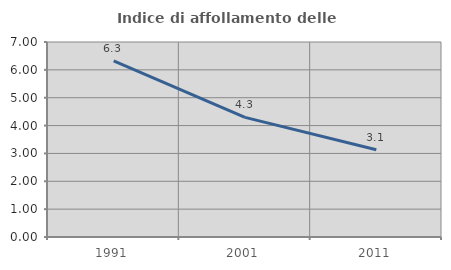
| Category | Indice di affollamento delle abitazioni  |
|---|---|
| 1991.0 | 6.32 |
| 2001.0 | 4.293 |
| 2011.0 | 3.131 |